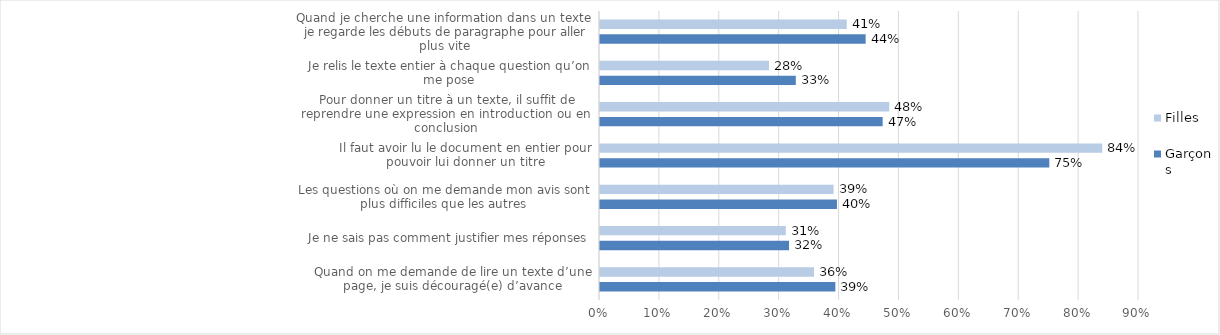
| Category | Garçons | Filles |
|---|---|---|
| Quand on me demande de lire un texte d’une page, je suis découragé(e) d’avance | 0.393 | 0.357 |
| Je ne sais pas comment justifier mes réponses | 0.316 | 0.31 |
| Les questions où on me demande mon avis sont plus difficiles que les autres | 0.396 | 0.39 |
| Il faut avoir lu le document en entier pour pouvoir lui donner un titre | 0.75 | 0.839 |
| Pour donner un titre à un texte, il suffit de reprendre une expression en introduction ou en conclusion | 0.472 | 0.483 |
| Je relis le texte entier à chaque question qu’on me pose | 0.327 | 0.282 |
| Quand je cherche une information dans un texte, je regarde les débuts de paragraphe pour aller plus vite | 0.444 | 0.412 |